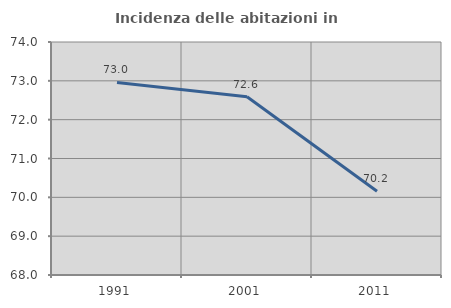
| Category | Incidenza delle abitazioni in proprietà  |
|---|---|
| 1991.0 | 72.958 |
| 2001.0 | 72.592 |
| 2011.0 | 70.155 |